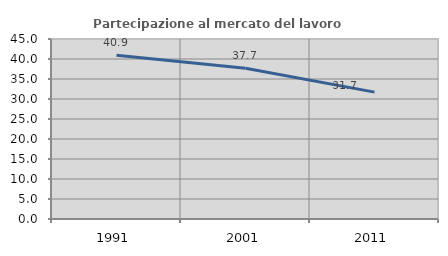
| Category | Partecipazione al mercato del lavoro  femminile |
|---|---|
| 1991.0 | 40.922 |
| 2001.0 | 37.681 |
| 2011.0 | 31.715 |